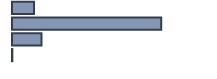
| Category | Series 0 |
|---|---|
| 0 | 10.968 |
| 1 | 74.233 |
| 2 | 14.634 |
| 3 | 0.165 |